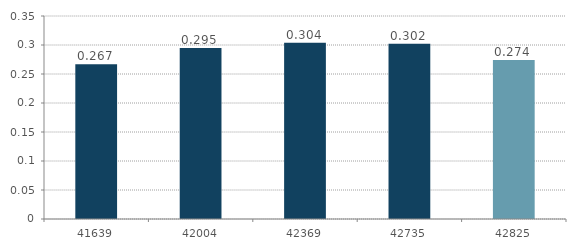
| Category | Series 0 |
|---|---|
| 41639.0 | 0.267 |
| 42004.0 | 0.295 |
| 42369.0 | 0.304 |
| 42735.0 | 0.302 |
| 42825.0 | 0.274 |